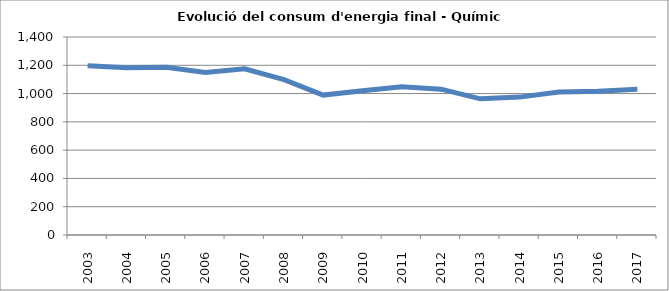
| Category | 1.197,5 1.183,4 1.186,1 1.149,9 1.174,8 1.098,0 989,2 1.020,4 1.047,6 1.031,1 962,9 975,0 1.011,6 1.016,1 1.030,8 |
|---|---|
| 2003.0 | 1197.5 |
| 2004.0 | 1183.4 |
| 2005.0 | 1186.1 |
| 2006.0 | 1149.9 |
| 2007.0 | 1174.8 |
| 2008.0 | 1098 |
| 2009.0 | 989.2 |
| 2010.0 | 1020.4 |
| 2011.0 | 1047.6 |
| 2012.0 | 1031.1 |
| 2013.0 | 962.9 |
| 2014.0 | 975 |
| 2015.0 | 1011.6 |
| 2016.0 | 1016.1 |
| 2017.0 | 1030.8 |